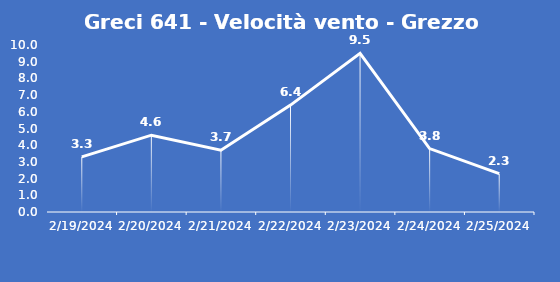
| Category | Greci 641 - Velocità vento - Grezzo (m/s) |
|---|---|
| 2/19/24 | 3.3 |
| 2/20/24 | 4.6 |
| 2/21/24 | 3.7 |
| 2/22/24 | 6.4 |
| 2/23/24 | 9.5 |
| 2/24/24 | 3.8 |
| 2/25/24 | 2.3 |